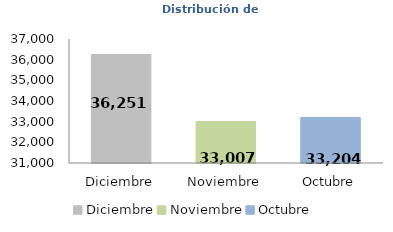
| Category | Series 0 |
|---|---|
| Diciembre | 36251 |
| Noviembre | 33007 |
| Octubre | 33204 |